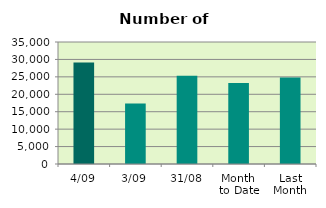
| Category | Series 0 |
|---|---|
| 4/09 | 29122 |
| 3/09 | 17322 |
| 31/08 | 25284 |
| Month 
to Date | 23221 |
| Last
Month | 24784.957 |